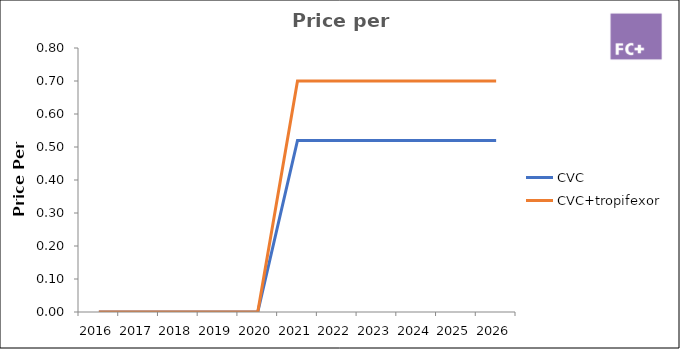
| Category | CVC | CVC+tropifexor |
|---|---|---|
| 2016.0 | 0 | 0 |
| 2017.0 | 0 | 0 |
| 2018.0 | 0 | 0 |
| 2019.0 | 0 | 0 |
| 2020.0 | 0 | 0 |
| 2021.0 | 0.52 | 0.7 |
| 2022.0 | 0.52 | 0.7 |
| 2023.0 | 0.52 | 0.7 |
| 2024.0 | 0.52 | 0.7 |
| 2025.0 | 0.52 | 0.7 |
| 2026.0 | 0.52 | 0.7 |